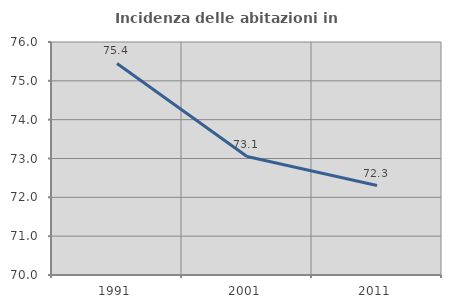
| Category | Incidenza delle abitazioni in proprietà  |
|---|---|
| 1991.0 | 75.448 |
| 2001.0 | 73.051 |
| 2011.0 | 72.304 |